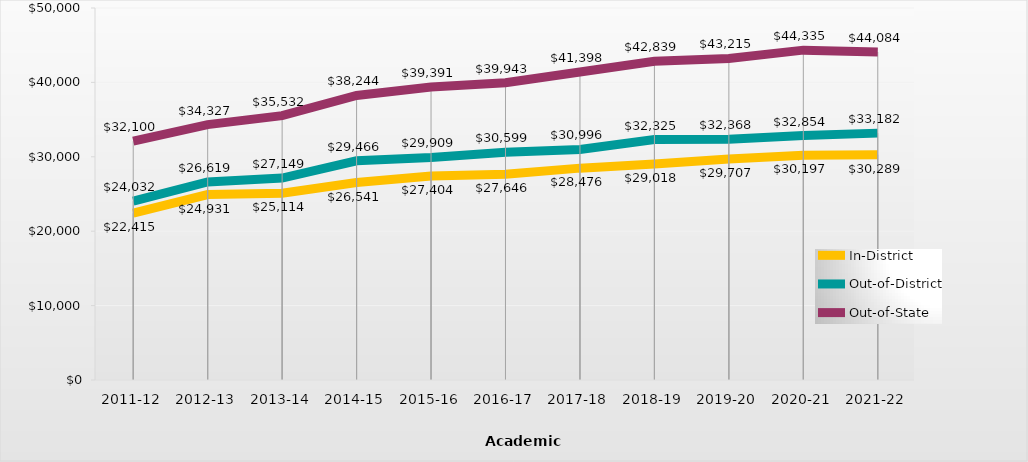
| Category | In-District | Out-of-District | Out-of-State |
|---|---|---|---|
| 2011-12 | 22415 | 24032 | 32100 |
| 2012-13 | 24931 | 26619 | 34327 |
| 2013-14 | 25114.27 | 27148.6 | 35532.25 |
| 2014-15 | 26541.34 | 29465.87 | 38243.8 |
| 2015-16 | 27404 | 29909 | 39391 |
| 2016-17 | 27646 | 30599 | 39943 |
| 2017-18 | 28476 | 30996 | 41398 |
| 2018-19 | 29018 | 32325 | 42839 |
| 2019-20 | 29707 | 32368 | 43215 |
| 2020-21 | 30197 | 32854 | 44335 |
| 2021-22 | 30289 | 33182 | 44084 |